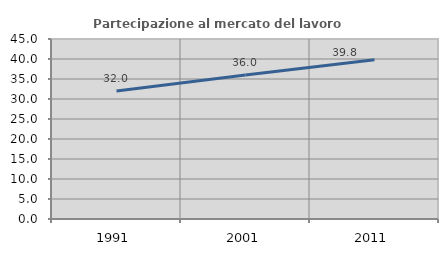
| Category | Partecipazione al mercato del lavoro  femminile |
|---|---|
| 1991.0 | 31.982 |
| 2001.0 | 36.028 |
| 2011.0 | 39.834 |